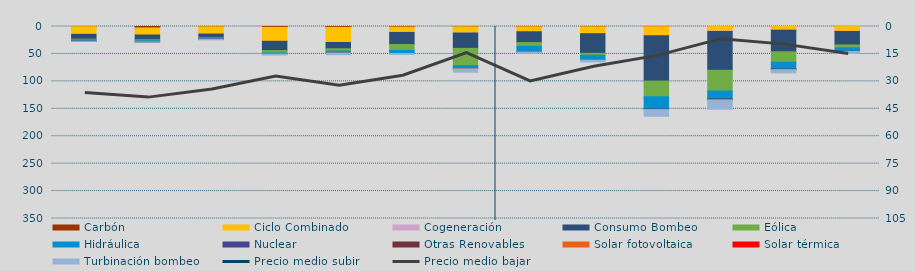
| Category | Carbón | Ciclo Combinado | Cogeneración | Consumo Bombeo | Eólica | Hidráulica | Nuclear | Otras Renovables | Solar fotovoltaica | Solar térmica | Turbinación bombeo |
|---|---|---|---|---|---|---|---|---|---|---|---|
| J | 346.1 | 13888.5 | 0 | 8869 | 1186.7 | 2488.5 | 187.1 | 15.9 | 0 | 0 | 184.3 |
| J | 2658.9 | 12785.9 | 0 | 8749.3 | 1887.5 | 1893.1 | 0 | 9.8 | 0 | 0 | 57.5 |
| A | 567.2 | 13236.4 | 10 | 6766.4 | 1241.9 | 1156.9 | 173 | 38 | 0 | 0 | 1232.6 |
| S | 1539.8 | 25452.8 | 8.7 | 16928.4 | 4457.4 | 1540.4 | 0 | 149.5 | 0 | 0 | 1916.2 |
| O | 1567.5 | 27564.7 | 0 | 11468.6 | 4269.6 | 3292.2 | 0 | 125.3 | 0 | 0 | 3130.6 |
| N | 1032.3 | 9659.8 | 141 | 22022.6 | 10965.1 | 5345.6 | 22.6 | 8.3 | 0 | 0 | 1780.7 |
| D | 528.1 | 11341.1 | 86.5 | 27911.2 | 31665.4 | 5608.2 | 0 | 173.7 | 5.9 | 0 | 6026.2 |
| E | 543.5 | 9049.8 | 14.2 | 19673 | 6854.8 | 10347.8 | 0 | 7.7 | 0 | 0 | 2307.6 |
| F | 538.4 | 12495.4 | 57.7 | 35793.2 | 3820.7 | 8168.3 | 0 | 265.3 | 0 | 0 | 3575.3 |
| M | 386.4 | 15979.9 | 321.7 | 82837 | 28654.5 | 22332.5 | 0 | 917.9 | 0 | 0 | 12258.3 |
| A | 97.2 | 8073.6 | 752.2 | 70876 | 37936.3 | 14340.4 | 0 | 1671.6 | 79.6 | 6.4 | 17035.3 |
| M | 18.3 | 6034.6 | 724.9 | 39295.9 | 19044.2 | 12773.5 | 8 | 691.1 | 39.5 | 82.2 | 5747.6 |
| J | 76.6 | 8592.1 | 398.7 | 24576 | 5144.6 | 6431.8 | 0 | 324 | 34.6 | 38.7 | 3246.7 |